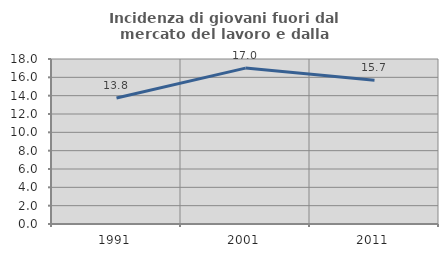
| Category | Incidenza di giovani fuori dal mercato del lavoro e dalla formazione  |
|---|---|
| 1991.0 | 13.752 |
| 2001.0 | 17.008 |
| 2011.0 | 15.691 |